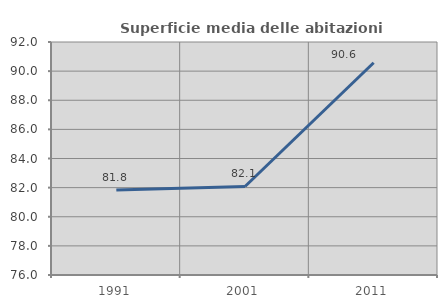
| Category | Superficie media delle abitazioni occupate |
|---|---|
| 1991.0 | 81.844 |
| 2001.0 | 82.08 |
| 2011.0 | 90.577 |